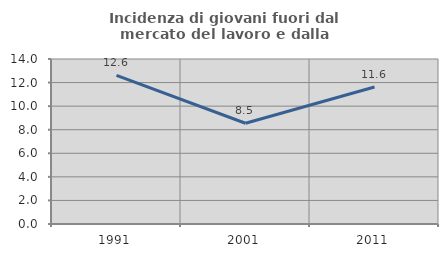
| Category | Incidenza di giovani fuori dal mercato del lavoro e dalla formazione  |
|---|---|
| 1991.0 | 12.603 |
| 2001.0 | 8.548 |
| 2011.0 | 11.628 |